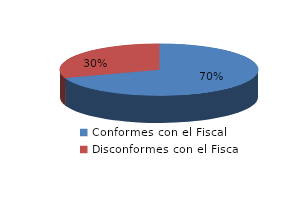
| Category | Series 0 |
|---|---|
| 0 | 726 |
| 1 | 316 |